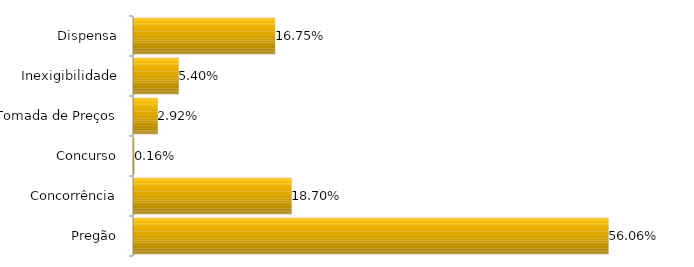
| Category | Series 0 |
|---|---|
| Pregão | 0.561 |
| Concorrência | 0.187 |
| Concurso | 0.002 |
| Tomada de Preços | 0.029 |
| Inexigibilidade | 0.054 |
| Dispensa | 0.168 |